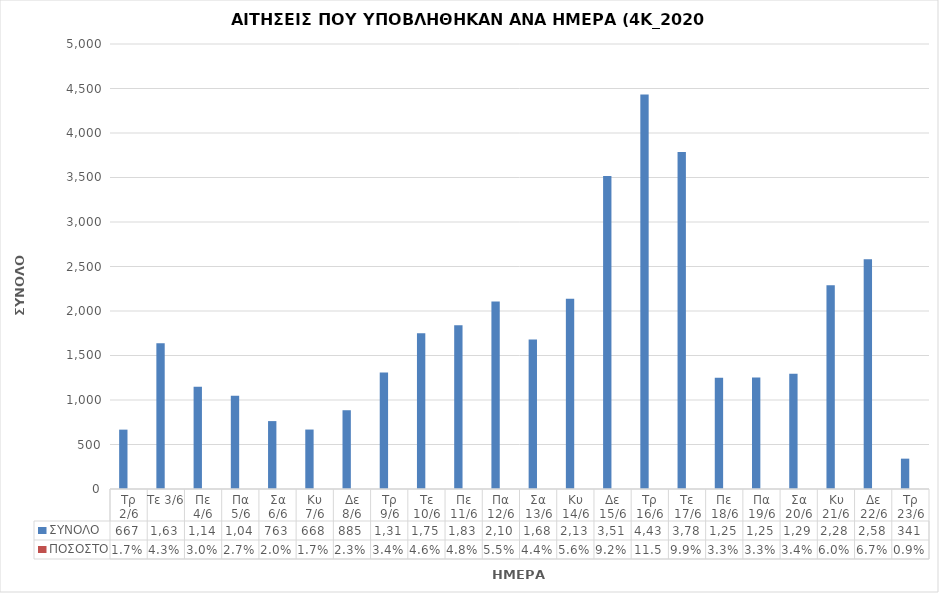
| Category | ΣΥΝΟΛΟ | ΠΟΣΟΣΤΟ |
|---|---|---|
| Τρ 2/6 | 667 | 0.017 |
| Τε 3/6 | 1637 | 0.043 |
| Πε 4/6 | 1149 | 0.03 |
| Πα 5/6 | 1047 | 0.027 |
| Σα 6/6 | 763 | 0.02 |
| Κυ 7/6 | 668 | 0.017 |
| Δε 8/6 | 885 | 0.023 |
| Τρ 9/6 | 1310 | 0.034 |
| Τε 10/6 | 1750 | 0.046 |
| Πε 11/6 | 1839 | 0.048 |
| Πα 12/6 | 2106 | 0.055 |
| Σα 13/6 | 1681 | 0.044 |
| Κυ 14/6 | 2137 | 0.056 |
| Δε 15/6 | 3518 | 0.092 |
| Τρ 16/6 | 4432 | 0.115 |
| Τε 17/6 | 3786 | 0.099 |
| Πε 18/6 | 1251 | 0.033 |
| Πα 19/6 | 1254 | 0.033 |
| Σα 20/6 | 1294 | 0.034 |
| Κυ 21/6 | 2289 | 0.06 |
| Δε 22/6 | 2581 | 0.067 |
| Τρ 23/6 | 341 | 0.009 |